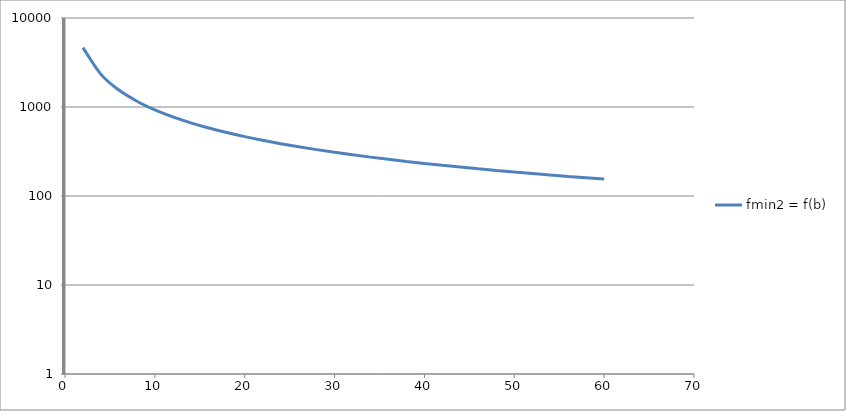
| Category | fmin2 = f(b) |
|---|---|
| 2.0 | 4648.649 |
| 4.0 | 2324.324 |
| 6.0 | 1549.55 |
| 8.0 | 1162.162 |
| 10.0 | 929.73 |
| 12.0 | 774.775 |
| 14.0 | 664.093 |
| 16.0 | 581.081 |
| 18.0 | 516.517 |
| 20.0 | 464.865 |
| 22.0 | 422.604 |
| 24.0 | 387.387 |
| 26.0 | 357.588 |
| 28.0 | 332.046 |
| 30.0 | 309.91 |
| 32.0 | 290.541 |
| 34.0 | 273.45 |
| 36.0 | 258.258 |
| 38.0 | 244.666 |
| 40.0 | 232.432 |
| 42.0 | 221.364 |
| 44.0 | 211.302 |
| 46.0 | 202.115 |
| 48.0 | 193.694 |
| 50.0 | 185.946 |
| 52.0 | 178.794 |
| 54.0 | 172.172 |
| 56.0 | 166.023 |
| 58.0 | 160.298 |
| 60.0 | 154.955 |